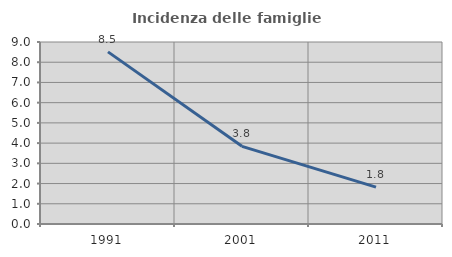
| Category | Incidenza delle famiglie numerose |
|---|---|
| 1991.0 | 8.512 |
| 2001.0 | 3.84 |
| 2011.0 | 1.822 |